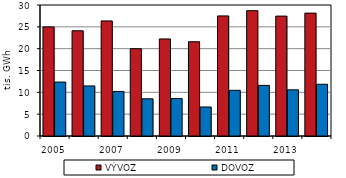
| Category | VÝVOZ   | DOVOZ |
|---|---|---|
| 2005.0 | 24985 | 12351 |
| 2006.0 | 24097 | 11466 |
| 2007.0 | 26357 | 10204 |
| 2008.0 | 19989 | 8520 |
| 2009.0 | 22230 | 8586 |
| 2010.0 | 21591 | 6642 |
| 2011.0 | 27501 | 10457 |
| 2012.0 | 28707 | 11587 |
| 2013.0 | 27458 | 10571 |
| 2014.0 | 28142 | 11842 |